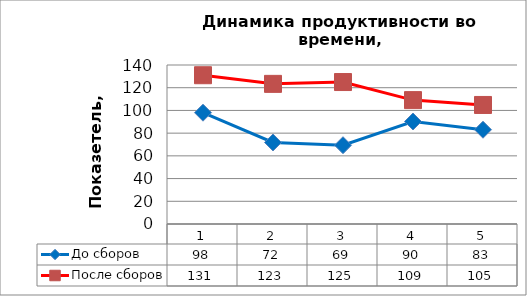
| Category | До сборов | После сборов |
|---|---|---|
| 0 | 98 | 131 |
| 1 | 71.778 | 123.391 |
| 2 | 69.35 | 125 |
| 3 | 90.24 | 109.083 |
| 4 | 83 | 104.808 |